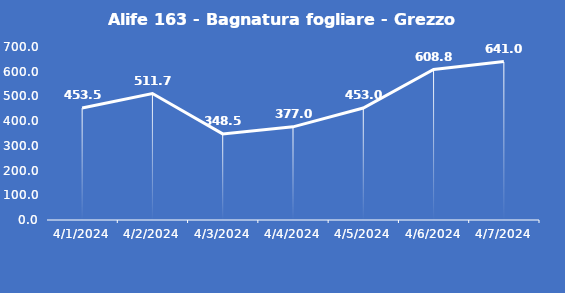
| Category | Alife 163 - Bagnatura fogliare - Grezzo (min) |
|---|---|
| 4/1/24 | 453.5 |
| 4/2/24 | 511.7 |
| 4/3/24 | 348.5 |
| 4/4/24 | 377 |
| 4/5/24 | 453 |
| 4/6/24 | 608.8 |
| 4/7/24 | 641 |